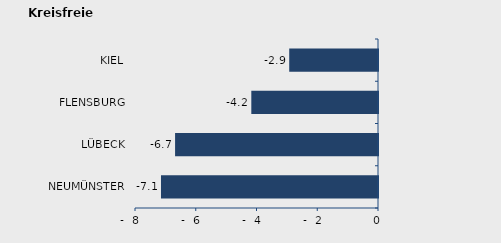
| Category | Überschuss der Geborenen (+) bzw. Gestorbenen (-) |
|---|---|
| NEUMÜNSTER | -7.144 |
| LÜBECK | -6.681 |
| FLENSBURG | -4.171 |
| KIEL | -2.923 |